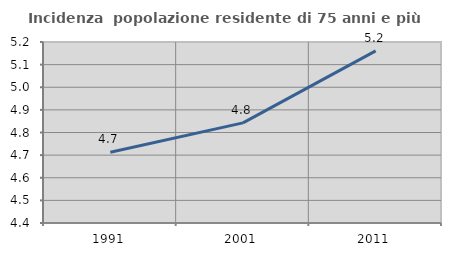
| Category | Incidenza  popolazione residente di 75 anni e più |
|---|---|
| 1991.0 | 4.713 |
| 2001.0 | 4.843 |
| 2011.0 | 5.161 |